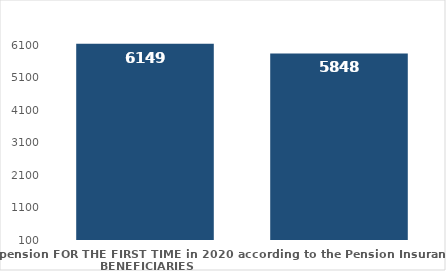
| Category | broj korisnika |
|---|---|
| Pension beneficiaries entitled to pension FOR THE FIRST TIME in 2020 according to the Pension Insurance Act  - NEW BENEFICIARIES | 6149 |
| Pension beneficiaries whose pension entitlement ceased in 2020  -  death caused,   
and who were retired according to the Pension Insurance Act   | 5848 |